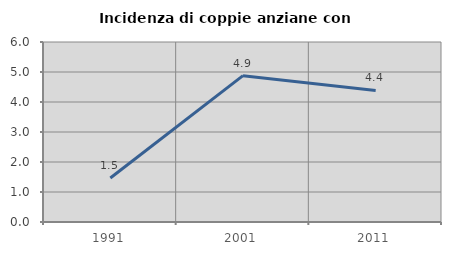
| Category | Incidenza di coppie anziane con figli |
|---|---|
| 1991.0 | 1.465 |
| 2001.0 | 4.878 |
| 2011.0 | 4.386 |